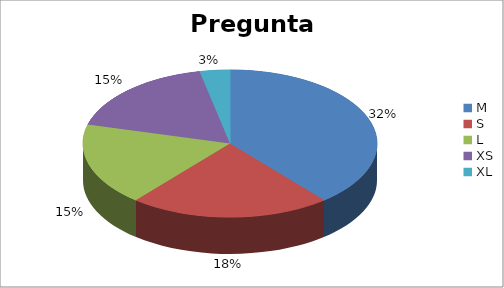
| Category | Series 0 |
|---|---|
| M | 0.322 |
| S | 0.182 |
| L | 0.15 |
| XS | 0.145 |
| XL | 0.028 |